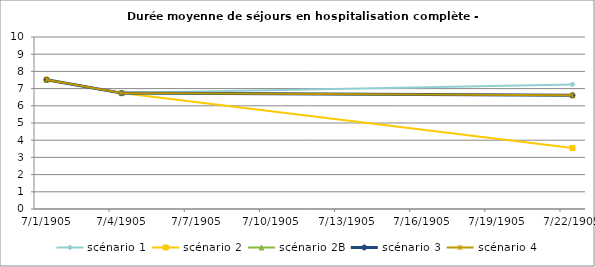
| Category | scénario 1 | scénario 2 | scénario 2B | scénario 3 | scénario 4 |
|---|---|---|---|---|---|
| 2009.0 | 7.519 | 7.519 | 7.519 | 7.519 | 7.519 |
| 2012.0 | 6.738 | 6.738 | 6.738 | 6.738 | 6.738 |
| 2030.0 | 7.244 | 3.54 | 6.612 | 6.612 | 6.612 |